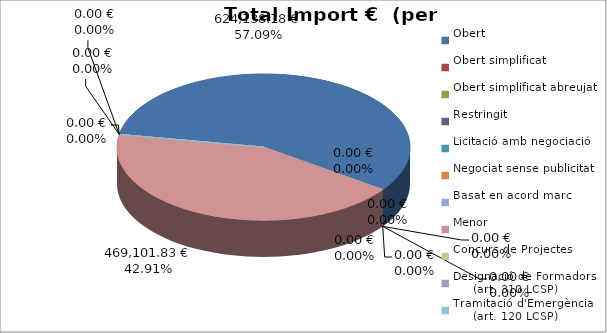
| Category | Total preu
(amb IVA) |
|---|---|
| Obert | 624138.18 |
| Obert simplificat | 0 |
| Obert simplificat abreujat | 0 |
| Restringit | 0 |
| Licitació amb negociació | 0 |
| Negociat sense publicitat | 0 |
| Basat en acord marc | 0 |
| Menor | 469101.83 |
| Concurs de Projectes | 0 |
| Designació de Formadors
     (art. 310 LCSP) | 0 |
| Tramitació d'Emergència
     (art. 120 LCSP) | 0 |